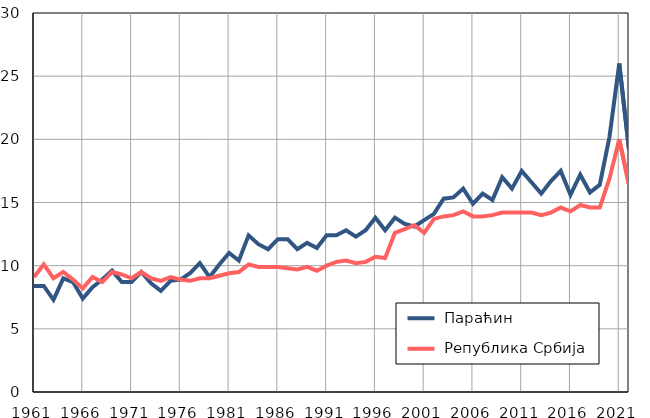
| Category |  Параћин |  Република Србија |
|---|---|---|
| 1961.0 | 8.4 | 9.1 |
| 1962.0 | 8.4 | 10.1 |
| 1963.0 | 7.3 | 9 |
| 1964.0 | 9 | 9.5 |
| 1965.0 | 8.7 | 8.9 |
| 1966.0 | 7.4 | 8.2 |
| 1967.0 | 8.3 | 9.1 |
| 1968.0 | 8.9 | 8.7 |
| 1969.0 | 9.6 | 9.5 |
| 1970.0 | 8.7 | 9.3 |
| 1971.0 | 8.7 | 9 |
| 1972.0 | 9.5 | 9.5 |
| 1973.0 | 8.6 | 9 |
| 1974.0 | 8 | 8.8 |
| 1975.0 | 8.8 | 9.1 |
| 1976.0 | 8.9 | 8.9 |
| 1977.0 | 9.4 | 8.8 |
| 1978.0 | 10.2 | 9 |
| 1979.0 | 9.1 | 9 |
| 1980.0 | 10.1 | 9.2 |
| 1981.0 | 11 | 9.4 |
| 1982.0 | 10.4 | 9.5 |
| 1983.0 | 12.4 | 10.1 |
| 1984.0 | 11.7 | 9.9 |
| 1985.0 | 11.3 | 9.9 |
| 1986.0 | 12.1 | 9.9 |
| 1987.0 | 12.1 | 9.8 |
| 1988.0 | 11.3 | 9.7 |
| 1989.0 | 11.8 | 9.9 |
| 1990.0 | 11.4 | 9.6 |
| 1991.0 | 12.4 | 10 |
| 1992.0 | 12.4 | 10.3 |
| 1993.0 | 12.8 | 10.4 |
| 1994.0 | 12.3 | 10.2 |
| 1995.0 | 12.8 | 10.3 |
| 1996.0 | 13.8 | 10.7 |
| 1997.0 | 12.8 | 10.6 |
| 1998.0 | 13.8 | 12.6 |
| 1999.0 | 13.3 | 12.9 |
| 2000.0 | 13.1 | 13.2 |
| 2001.0 | 13.6 | 12.6 |
| 2002.0 | 14.1 | 13.7 |
| 2003.0 | 15.3 | 13.9 |
| 2004.0 | 15.4 | 14 |
| 2005.0 | 16.1 | 14.3 |
| 2006.0 | 14.9 | 13.9 |
| 2007.0 | 15.7 | 13.9 |
| 2008.0 | 15.2 | 14 |
| 2009.0 | 17 | 14.2 |
| 2010.0 | 16.1 | 14.2 |
| 2011.0 | 17.5 | 14.2 |
| 2012.0 | 16.6 | 14.2 |
| 2013.0 | 15.7 | 14 |
| 2014.0 | 16.7 | 14.2 |
| 2015.0 | 17.5 | 14.6 |
| 2016.0 | 15.6 | 14.3 |
| 2017.0 | 17.2 | 14.8 |
| 2018.0 | 15.8 | 14.6 |
| 2019.0 | 16.4 | 14.6 |
| 2020.0 | 20.2 | 16.9 |
| 2021.0 | 26 | 20 |
| 2022.0 | 19.2 | 16.4 |